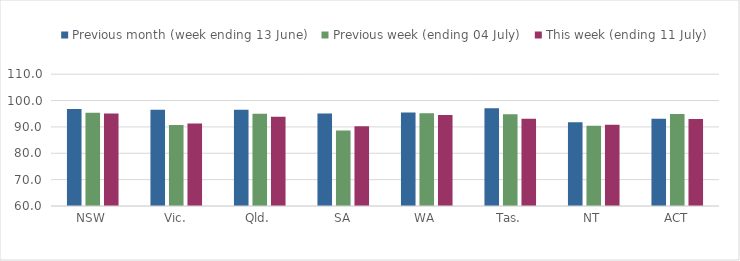
| Category | Previous month (week ending 13 June) | Previous week (ending 04 July) | This week (ending 11 July) |
|---|---|---|---|
| NSW | 96.787 | 95.326 | 95.132 |
| Vic. | 96.518 | 90.767 | 91.321 |
| Qld. | 96.48 | 94.992 | 93.84 |
| SA | 95.054 | 88.65 | 90.219 |
| WA | 95.496 | 95.215 | 94.478 |
| Tas. | 97.114 | 94.833 | 93.093 |
| NT | 91.721 | 90.476 | 90.825 |
| ACT | 93.095 | 94.856 | 92.972 |